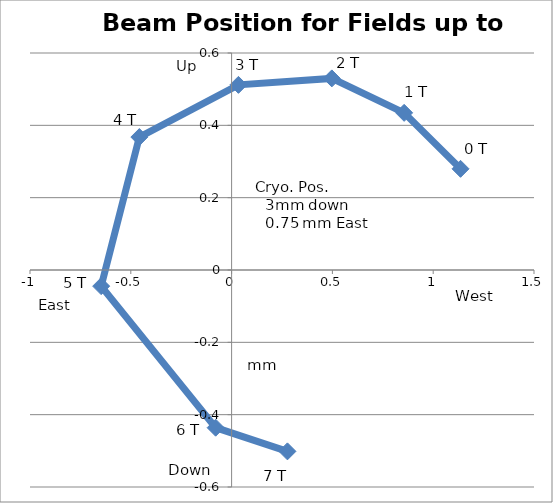
| Category | Series 0 |
|---|---|
| 1.1355932203389831 | 0.28 |
| 0.8559322033898304 | 0.435 |
| 0.4971751412429378 | 0.53 |
| 0.03389830508474578 | 0.512 |
| -0.4576271186440678 | 0.368 |
| -0.6468926553672316 | -0.045 |
| -0.0790960451977401 | -0.436 |
| 0.2768361581920904 | -0.501 |